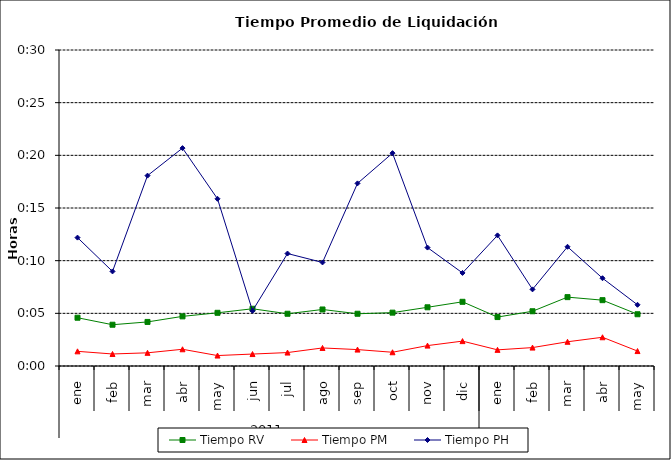
| Category | Tiempo RV | Tiempo PM | Tiempo PH |
|---|---|---|---|
| 0 | 0.003 | 0.001 | 0.009 |
| 1 | 0.003 | 0.001 | 0.006 |
| 2 | 0.003 | 0.001 | 0.013 |
| 3 | 0.003 | 0.001 | 0.014 |
| 4 | 0.004 | 0.001 | 0.011 |
| 5 | 0.004 | 0.001 | 0.004 |
| 6 | 0.003 | 0.001 | 0.007 |
| 7 | 0.004 | 0.001 | 0.007 |
| 8 | 0.003 | 0.001 | 0.012 |
| 9 | 0.004 | 0.001 | 0.014 |
| 10 | 0.004 | 0.001 | 0.008 |
| 11 | 0.004 | 0.002 | 0.006 |
| 12 | 0.003 | 0.001 | 0.009 |
| 13 | 0.004 | 0.001 | 0.005 |
| 14 | 0.005 | 0.002 | 0.008 |
| 15 | 0.004 | 0.002 | 0.006 |
| 16 | 0.003 | 0.001 | 0.004 |